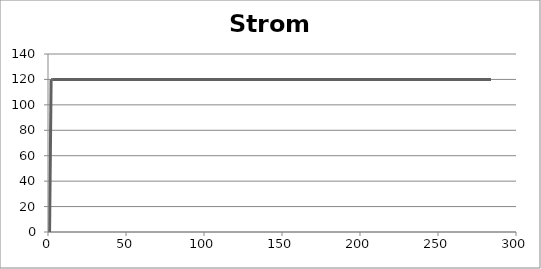
| Category | Strom |
|---|---|
| 0 | 0 |
| 1 | 120 |
| 2 | 120 |
| 3 | 120 |
| 4 | 120 |
| 5 | 120 |
| 6 | 120 |
| 7 | 120 |
| 8 | 120 |
| 9 | 120 |
| 10 | 120 |
| 11 | 120 |
| 12 | 120 |
| 13 | 120 |
| 14 | 120 |
| 15 | 120 |
| 16 | 120 |
| 17 | 120 |
| 18 | 120 |
| 19 | 120 |
| 20 | 120 |
| 21 | 120 |
| 22 | 120 |
| 23 | 120 |
| 24 | 120 |
| 25 | 120 |
| 26 | 120 |
| 27 | 120 |
| 28 | 120 |
| 29 | 120 |
| 30 | 120 |
| 31 | 120 |
| 32 | 120 |
| 33 | 120 |
| 34 | 120 |
| 35 | 120 |
| 36 | 120 |
| 37 | 120 |
| 38 | 120 |
| 39 | 120 |
| 40 | 120 |
| 41 | 120 |
| 42 | 120 |
| 43 | 120 |
| 44 | 120 |
| 45 | 120 |
| 46 | 120 |
| 47 | 120 |
| 48 | 120 |
| 49 | 120 |
| 50 | 120 |
| 51 | 120 |
| 52 | 120 |
| 53 | 120 |
| 54 | 120 |
| 55 | 120 |
| 56 | 120 |
| 57 | 120 |
| 58 | 120 |
| 59 | 120 |
| 60 | 120 |
| 61 | 120 |
| 62 | 120 |
| 63 | 120 |
| 64 | 120 |
| 65 | 120 |
| 66 | 120 |
| 67 | 120 |
| 68 | 120 |
| 69 | 120 |
| 70 | 120 |
| 71 | 120 |
| 72 | 120 |
| 73 | 120 |
| 74 | 120 |
| 75 | 120 |
| 76 | 120 |
| 77 | 120 |
| 78 | 120 |
| 79 | 120 |
| 80 | 120 |
| 81 | 120 |
| 82 | 120 |
| 83 | 120 |
| 84 | 120 |
| 85 | 120 |
| 86 | 120 |
| 87 | 120 |
| 88 | 120 |
| 89 | 120 |
| 90 | 120 |
| 91 | 120 |
| 92 | 120 |
| 93 | 120 |
| 94 | 120 |
| 95 | 120 |
| 96 | 120 |
| 97 | 120 |
| 98 | 120 |
| 99 | 120 |
| 100 | 120 |
| 101 | 120 |
| 102 | 120 |
| 103 | 120 |
| 104 | 120 |
| 105 | 120 |
| 106 | 120 |
| 107 | 120 |
| 108 | 120 |
| 109 | 120 |
| 110 | 120 |
| 111 | 120 |
| 112 | 120 |
| 113 | 120 |
| 114 | 120 |
| 115 | 120 |
| 116 | 120 |
| 117 | 120 |
| 118 | 120 |
| 119 | 120 |
| 120 | 120 |
| 121 | 120 |
| 122 | 120 |
| 123 | 120 |
| 124 | 120 |
| 125 | 120 |
| 126 | 120 |
| 127 | 120 |
| 128 | 120 |
| 129 | 120 |
| 130 | 120 |
| 131 | 120 |
| 132 | 120 |
| 133 | 120 |
| 134 | 120 |
| 135 | 120 |
| 136 | 120 |
| 137 | 120 |
| 138 | 120 |
| 139 | 120 |
| 140 | 120 |
| 141 | 120 |
| 142 | 120 |
| 143 | 120 |
| 144 | 120 |
| 145 | 120 |
| 146 | 120 |
| 147 | 120 |
| 148 | 120 |
| 149 | 120 |
| 150 | 120 |
| 151 | 120 |
| 152 | 120 |
| 153 | 120 |
| 154 | 120 |
| 155 | 120 |
| 156 | 120 |
| 157 | 120 |
| 158 | 120 |
| 159 | 120 |
| 160 | 120 |
| 161 | 120 |
| 162 | 120 |
| 163 | 120 |
| 164 | 120 |
| 165 | 120 |
| 166 | 120 |
| 167 | 120 |
| 168 | 120 |
| 169 | 120 |
| 170 | 120 |
| 171 | 120 |
| 172 | 120 |
| 173 | 120 |
| 174 | 120 |
| 175 | 120 |
| 176 | 120 |
| 177 | 120 |
| 178 | 120 |
| 179 | 120 |
| 180 | 120 |
| 181 | 120 |
| 182 | 120 |
| 183 | 120 |
| 184 | 120 |
| 185 | 120 |
| 186 | 120 |
| 187 | 120 |
| 188 | 120 |
| 189 | 120 |
| 190 | 120 |
| 191 | 120 |
| 192 | 120 |
| 193 | 120 |
| 194 | 120 |
| 195 | 120 |
| 196 | 120 |
| 197 | 120 |
| 198 | 120 |
| 199 | 120 |
| 200 | 120 |
| 201 | 120 |
| 202 | 120 |
| 203 | 120 |
| 204 | 120 |
| 205 | 120 |
| 206 | 120 |
| 207 | 120 |
| 208 | 120 |
| 209 | 120 |
| 210 | 120 |
| 211 | 120 |
| 212 | 120 |
| 213 | 120 |
| 214 | 120 |
| 215 | 120 |
| 216 | 120 |
| 217 | 120 |
| 218 | 120 |
| 219 | 120 |
| 220 | 120 |
| 221 | 120 |
| 222 | 120 |
| 223 | 120 |
| 224 | 120 |
| 225 | 120 |
| 226 | 120 |
| 227 | 120 |
| 228 | 120 |
| 229 | 120 |
| 230 | 120 |
| 231 | 120 |
| 232 | 120 |
| 233 | 120 |
| 234 | 120 |
| 235 | 120 |
| 236 | 120 |
| 237 | 120 |
| 238 | 120 |
| 239 | 120 |
| 240 | 120 |
| 241 | 120 |
| 242 | 120 |
| 243 | 120 |
| 244 | 120 |
| 245 | 120 |
| 246 | 120 |
| 247 | 120 |
| 248 | 120 |
| 249 | 120 |
| 250 | 120 |
| 251 | 120 |
| 252 | 120 |
| 253 | 120 |
| 254 | 120 |
| 255 | 120 |
| 256 | 120 |
| 257 | 120 |
| 258 | 120 |
| 259 | 120 |
| 260 | 120 |
| 261 | 120 |
| 262 | 120 |
| 263 | 120 |
| 264 | 120 |
| 265 | 120 |
| 266 | 120 |
| 267 | 120 |
| 268 | 120 |
| 269 | 120 |
| 270 | 120 |
| 271 | 120 |
| 272 | 120 |
| 273 | 120 |
| 274 | 120 |
| 275 | 120 |
| 276 | 120 |
| 277 | 120 |
| 278 | 120 |
| 279 | 120 |
| 280 | 120 |
| 281 | 120 |
| 282 | 120 |
| 283 | 120 |